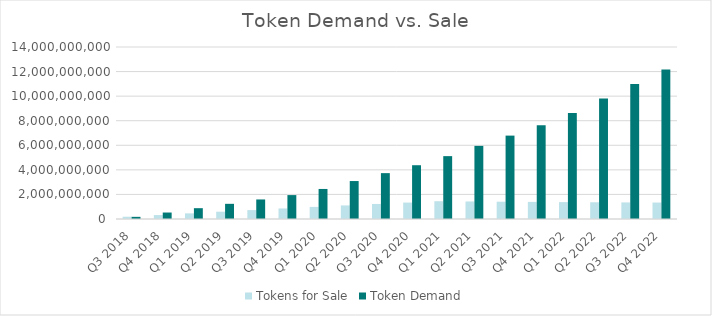
| Category | Tokens for Sale | Token Demand |
|---|---|---|
| Q3 2018 | 185250000 | 175705200 |
| Q4 2018 | 322255050 | 527115600 |
| Q1 2019 | 458887028.757 | 880414275 |
| Q2 2019 | 594119275.673 | 1235601225 |
| Q3 2019 | 727087570.222 | 1590788175 |
| Q4 2019 | 857084558.144 | 1945975125 |
| Q1 2020 | 983550653.693 | 2445556462.5 |
| Q2 2020 | 1106062499.289 | 3089532187.5 |
| Q3 2020 | 1224319911.248 | 3733507912.5 |
| Q4 2020 | 1338132080.687 | 4377483637.5 |
| Q1 2021 | 1447403643.337 | 5117186362.5 |
| Q2 2021 | 1426581882.842 | 5952616087.5 |
| Q3 2021 | 1407803399.801 | 6788045812.5 |
| Q4 2021 | 1390906489.409 | 7623475537.5 |
| Q1 2022 | 1375745461.606 | 8629791600 |
| Q2 2022 | 1362188776.201 | 9806994000 |
| Q3 2022 | 1350117422.744 | 10984196400 |
| Q4 2022 | 1339423509.717 | 12161398800 |